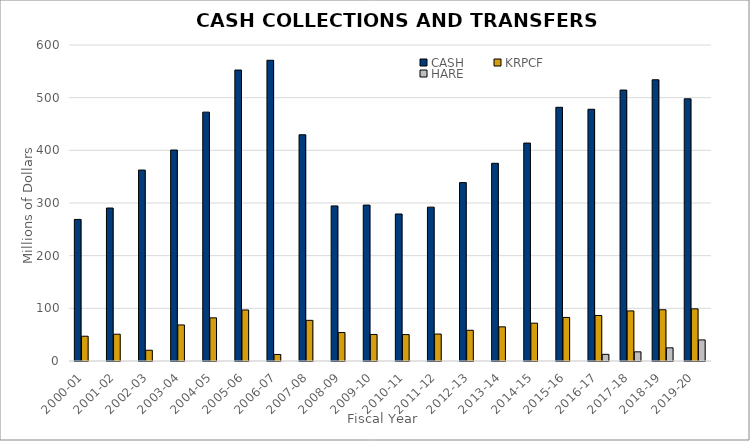
| Category | CASH | KRPCF | HARE |
|---|---|---|---|
| 2000-01 | 268.816 | 47.048 | 0 |
| 2001-02 | 290.472 | 50.874 | 0 |
| 2002-03 | 362.561 | 20.4 | 0 |
| 2003-04 | 400.59 | 68.456 | 0 |
| 2004-05 | 472.539 | 81.928 | 0 |
| 2005-06 | 552.45 | 96.879 | 0 |
| 2006-07 | 570.994 | 12.414 | 0 |
| 2007-08 | 429.54 | 77.2 | 0 |
| 2008-09 | 294.464 | 54.029 | 0 |
| 2009-10 | 296.033 | 50.392 | 0 |
| 2010-11 | 279.151 | 50.167 | 0 |
| 2011-12 | 292.152 | 51.203 | 0 |
| 2012-13 | 338.745 | 58.317 | 0 |
| 2013-14 | 375.408 | 64.806 | 0 |
| 2014-15 | 413.779 | 71.841 | 0 |
| 2015-16 | 481.72 | 82.717 | 0 |
| 2016-17 | 478.005 | 86.406 | 12.668 |
| 2017-18 | 514.441 | 95.101 | 17.395 |
| 2018-19 | 533.981 | 97.289 | 25 |
| 2019-20 | 497.792 | 99.032 | 40 |